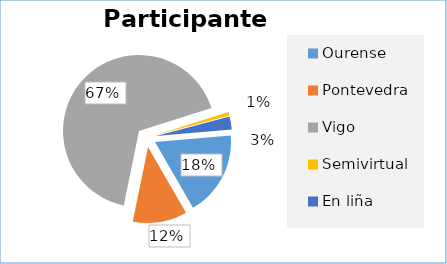
| Category | Series 0 |
|---|---|
| Ourense | 205 |
| Pontevedra | 131 |
| Vigo | 759 |
| Semivirtual | 9 |
| En liña | 31 |